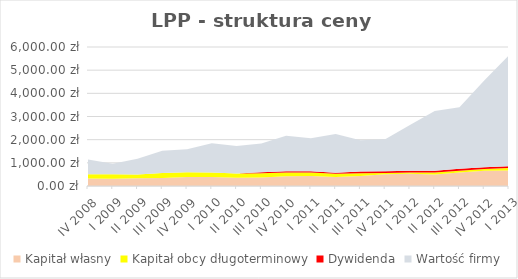
| Category | Kapitał własny | Kapitał obcy długoterminowy | Dywidenda | Wartość firmy |
|---|---|---|---|---|
| IV 2008 | 322.991 | 184.181 | 0 | 632.828 |
| I 2009 | 316.165 | 186.998 | 0 | 456.337 |
| II 2009 | 334.77 | 158.263 | 0 | 681.967 |
| III 2009 | 343.892 | 218.055 | 0 | 963.053 |
| IV 2009 | 391.765 | 198.7 | 0 | 999.535 |
| I 2010 | 389.528 | 196.398 | 0 | 1255.574 |
| II 2010 | 359.121 | 177.548 | 0 | 1185.331 |
| III 2010 | 369.747 | 176.931 | 50 | 1238.322 |
| IV 2010 | 420.883 | 160.703 | 50 | 1533.413 |
| I 2011 | 434.848 | 149.167 | 50 | 1425.985 |
| II 2011 | 393.022 | 131.352 | 50 | 1665.626 |
| III 2011 | 435.215 | 114.522 | 76.86 | 1348.402 |
| IV 2011 | 510.783 | 50.2 | 76.86 | 1378.157 |
| I 2012 | 533.025 | 48.898 | 76.86 | 1976.218 |
| II 2012 | 498.579 | 84.36 | 76.86 | 2580.701 |
| III 2012 | 581.338 | 80.755 | 77.36 | 2660.548 |
| IV 2012 | 662.358 | 71.577 | 77.36 | 3738.705 |
| I 2013 | 673.436 | 107.15 | 77.36 | 4792.054 |